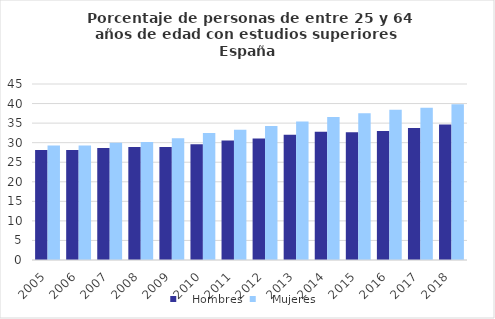
| Category |    Hombres |    Mujeres |
|---|---|---|
| 2005.0 | 28.145 | 29.261 |
| 2006.0 | 28.145 | 29.261 |
| 2007.0 | 28.611 | 29.956 |
| 2008.0 | 28.865 | 30.189 |
| 2009.0 | 28.886 | 31.116 |
| 2010.0 | 29.568 | 32.492 |
| 2011.0 | 30.523 | 33.327 |
| 2012.0 | 31.075 | 34.241 |
| 2013.0 | 32.048 | 35.431 |
| 2014.0 | 32.813 | 36.548 |
| 2015.0 | 32.657 | 37.504 |
| 2016.0 | 32.981 | 38.397 |
| 2017.0 | 33.755 | 38.934 |
| 2018.0 | 34.64 | 39.847 |